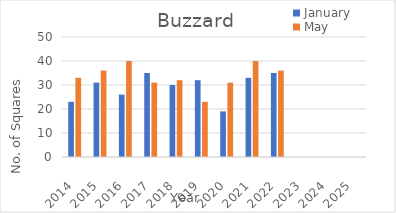
| Category | January | May |
|---|---|---|
| 2014.0 | 23 | 33 |
| 2015.0 | 31 | 36 |
| 2016.0 | 26 | 40 |
| 2017.0 | 35 | 31 |
| 2018.0 | 30 | 32 |
| 2019.0 | 32 | 23 |
| 2020.0 | 19 | 31 |
| 2021.0 | 33 | 40 |
| 2022.0 | 35 | 36 |
| 2023.0 | 0 | 0 |
| 2024.0 | 0 | 0 |
| 2025.0 | 0 | 0 |